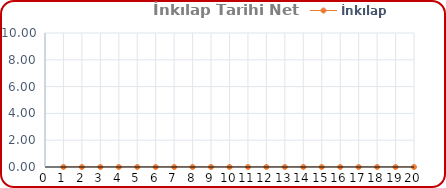
| Category | İnkılap Tarihi |
|---|---|
| 0 | 0 |
| 1 | 0 |
| 2 | 0 |
| 3 | 0 |
| 4 | 0 |
| 5 | 0 |
| 6 | 0 |
| 7 | 0 |
| 8 | 0 |
| 9 | 0 |
| 10 | 0 |
| 11 | 0 |
| 12 | 0 |
| 13 | 0 |
| 14 | 0 |
| 15 | 0 |
| 16 | 0 |
| 17 | 0 |
| 18 | 0 |
| 19 | 0 |